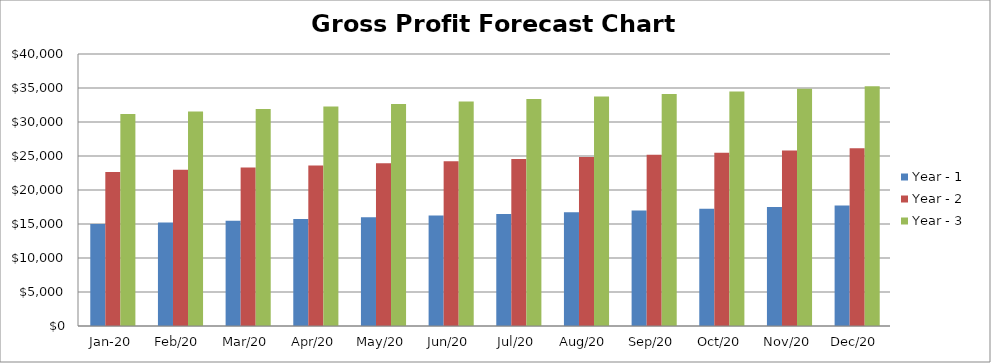
| Category | Year - 1 | Year - 2 | Year - 3 |
|---|---|---|---|
| 2020-01-01 | 14985 | 22662 | 31164 |
| 2020-02-01 | 15234.75 | 22976.75 | 31535 |
| 2020-03-01 | 15484.5 | 23291.5 | 31906 |
| 2020-04-01 | 15734.25 | 23606.25 | 32277 |
| 2020-05-01 | 15984 | 23921 | 32648 |
| 2020-06-01 | 16233.75 | 24235.75 | 33019 |
| 2020-07-01 | 16483.5 | 24550.5 | 33390 |
| 2020-08-01 | 16733.25 | 24865.25 | 33761 |
| 2020-09-01 | 16983 | 25180 | 34132 |
| 2020-10-01 | 17232.75 | 25494.75 | 34503 |
| 2020-11-01 | 17482.5 | 25809.5 | 34874 |
| 2020-12-01 | 17732.25 | 26124.25 | 35245 |